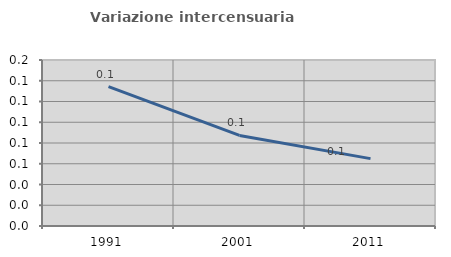
| Category | Variazione intercensuaria annua |
|---|---|
| 1991.0 | 0.134 |
| 2001.0 | 0.087 |
| 2011.0 | 0.065 |